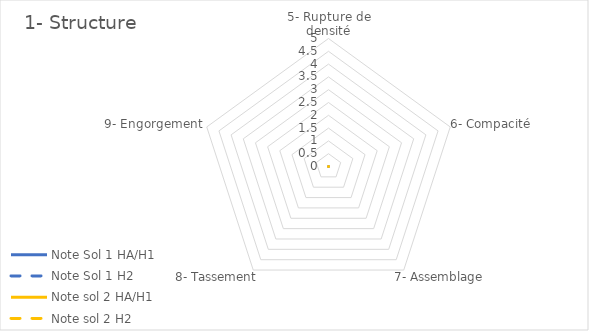
| Category | Note Sol 1 | Note sol 2 |
|---|---|---|
| 5- Rupture de densité | 0 | 0 |
| 6- Compacité | 0 | 0 |
| 7- Assemblage | 0 | 0 |
| 8- Tassement | 0 | 0 |
| 9- Engorgement | 0 | 0 |